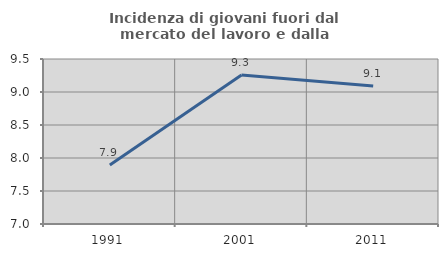
| Category | Incidenza di giovani fuori dal mercato del lavoro e dalla formazione  |
|---|---|
| 1991.0 | 7.895 |
| 2001.0 | 9.259 |
| 2011.0 | 9.091 |